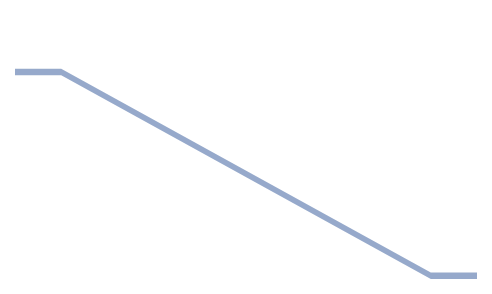
| Category | Series 0 | Series 1 | Series 2 |
|---|---|---|---|
| 0.0 | 1650 | 200 | 6250 |
| 10.0 | 1650 | 200 | 6250 |
| 90.0 | 7900 | 200 | 0 |
| 100.0 | 7900 | 200 | 0 |